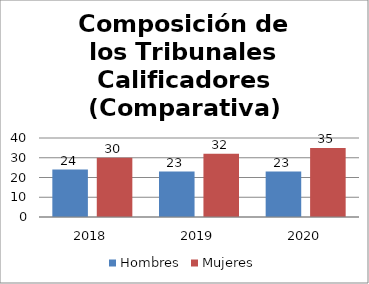
| Category | Hombres | Mujeres |
|---|---|---|
| 2018.0 | 24 | 30 |
| 2019.0 | 23 | 32 |
| 2020.0 | 23 | 35 |